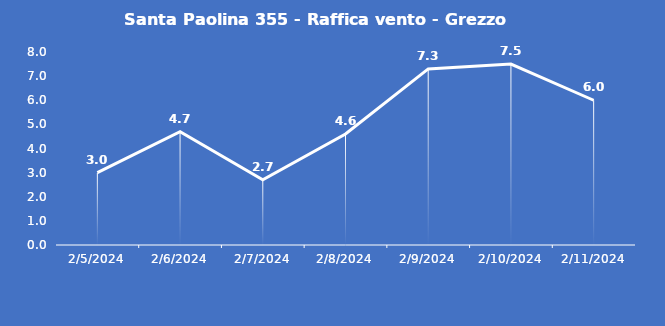
| Category | Santa Paolina 355 - Raffica vento - Grezzo (m/s) |
|---|---|
| 2/5/24 | 3 |
| 2/6/24 | 4.7 |
| 2/7/24 | 2.7 |
| 2/8/24 | 4.6 |
| 2/9/24 | 7.3 |
| 2/10/24 | 7.5 |
| 2/11/24 | 6 |